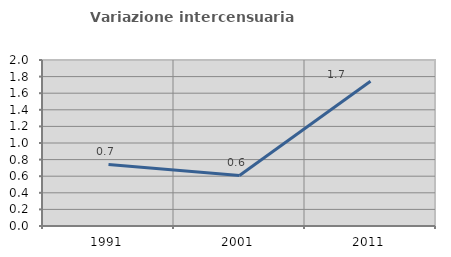
| Category | Variazione intercensuaria annua |
|---|---|
| 1991.0 | 0.742 |
| 2001.0 | 0.609 |
| 2011.0 | 1.743 |